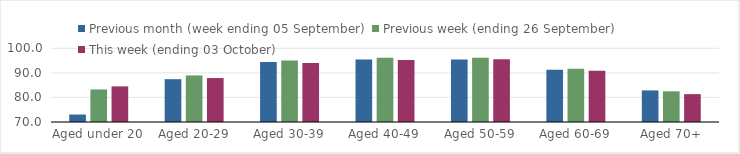
| Category | Previous month (week ending 05 September) | Previous week (ending 26 September) | This week (ending 03 October) |
|---|---|---|---|
| Aged under 20 | 73.04 | 83.25 | 84.5 |
| Aged 20-29 | 87.42 | 88.95 | 87.89 |
| Aged 30-39 | 94.45 | 95.04 | 94.06 |
| Aged 40-49 | 95.44 | 96.13 | 95.21 |
| Aged 50-59 | 95.43 | 96.19 | 95.52 |
| Aged 60-69 | 91.24 | 91.63 | 90.87 |
| Aged 70+ | 82.85 | 82.49 | 81.34 |